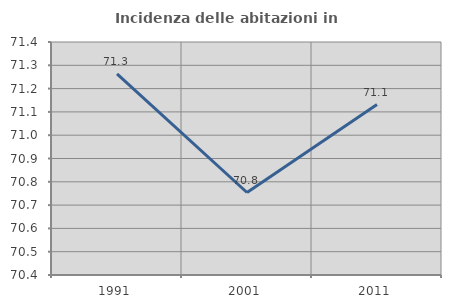
| Category | Incidenza delle abitazioni in proprietà  |
|---|---|
| 1991.0 | 71.263 |
| 2001.0 | 70.754 |
| 2011.0 | 71.131 |